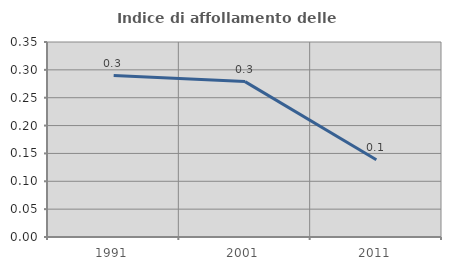
| Category | Indice di affollamento delle abitazioni  |
|---|---|
| 1991.0 | 0.29 |
| 2001.0 | 0.279 |
| 2011.0 | 0.139 |